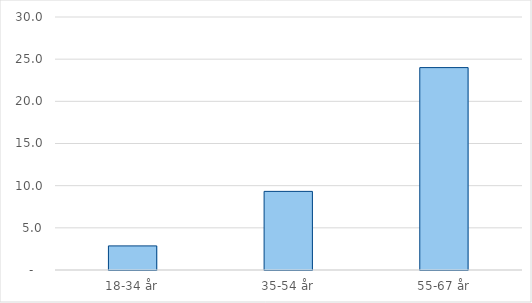
| Category | Hele landet |
|---|---|
| 18-34 år | 2.857 |
| 35-54 år | 9.323 |
| 55-67 år | 23.999 |